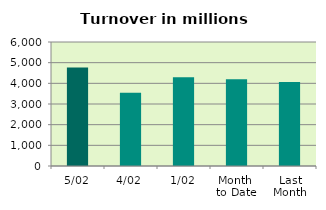
| Category | Series 0 |
|---|---|
| 5/02 | 4771.292 |
| 4/02 | 3547.48 |
| 1/02 | 4291.157 |
| Month 
to Date | 4203.309 |
| Last
Month | 4067.116 |